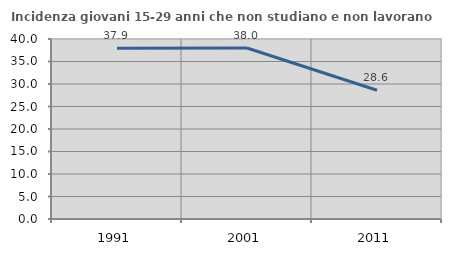
| Category | Incidenza giovani 15-29 anni che non studiano e non lavorano  |
|---|---|
| 1991.0 | 37.917 |
| 2001.0 | 38 |
| 2011.0 | 28.621 |